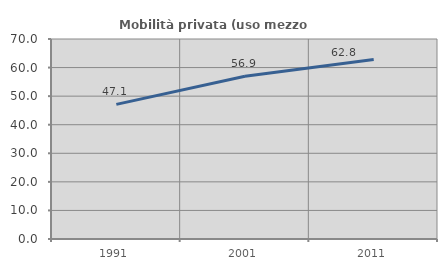
| Category | Mobilità privata (uso mezzo privato) |
|---|---|
| 1991.0 | 47.126 |
| 2001.0 | 56.932 |
| 2011.0 | 62.849 |